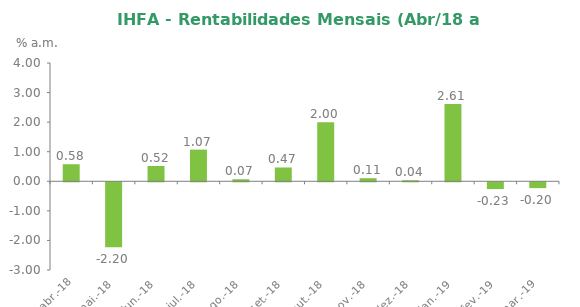
| Category | Series 0 |
|---|---|
| 2018-04-30 | 0.576 |
| 2018-05-30 | -2.199 |
| 2018-06-29 | 0.517 |
| 2018-07-31 | 1.072 |
| 2018-08-31 | 0.069 |
| 2018-09-28 | 0.467 |
| 2018-10-31 | 2 |
| 2018-11-30 | 0.105 |
| 2018-12-31 | 0.035 |
| 2019-01-31 | 2.611 |
| 2019-02-28 | -0.229 |
| 2019-03-31 | -0.198 |